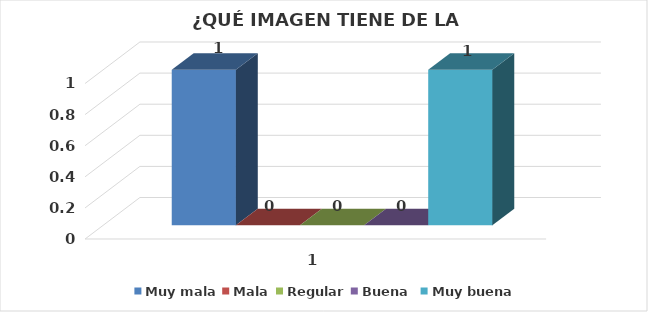
| Category | Muy mala | Mala | Regular | Buena  | Muy buena |
|---|---|---|---|---|---|
| 0 | 1 | 0 | 0 | 0 | 1 |